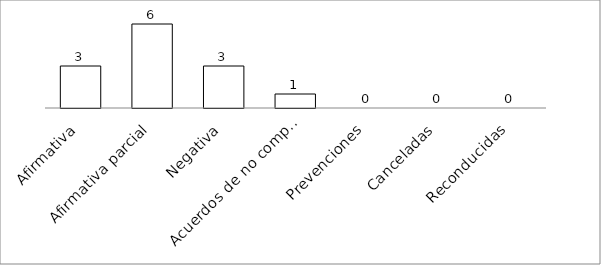
| Category | Series 0 |
|---|---|
| Afirmativa | 3 |
| Afirmativa parcial | 6 |
| Negativa | 3 |
| Acuerdos de no competencia | 1 |
| Prevenciones | 0 |
| Canceladas | 0 |
| Reconducidas | 0 |